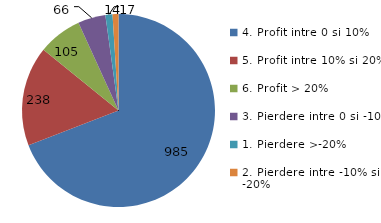
| Category | Series 0 |
|---|---|
| 4. Profit intre 0 si 10% | 985 |
| 5. Profit intre 10% si 20% | 238 |
| 6. Profit > 20% | 105 |
| 3. Pierdere intre 0 si -10% | 66 |
| 1. Pierdere >-20% | 17 |
| 2. Pierdere intre -10% si -20% | 14 |